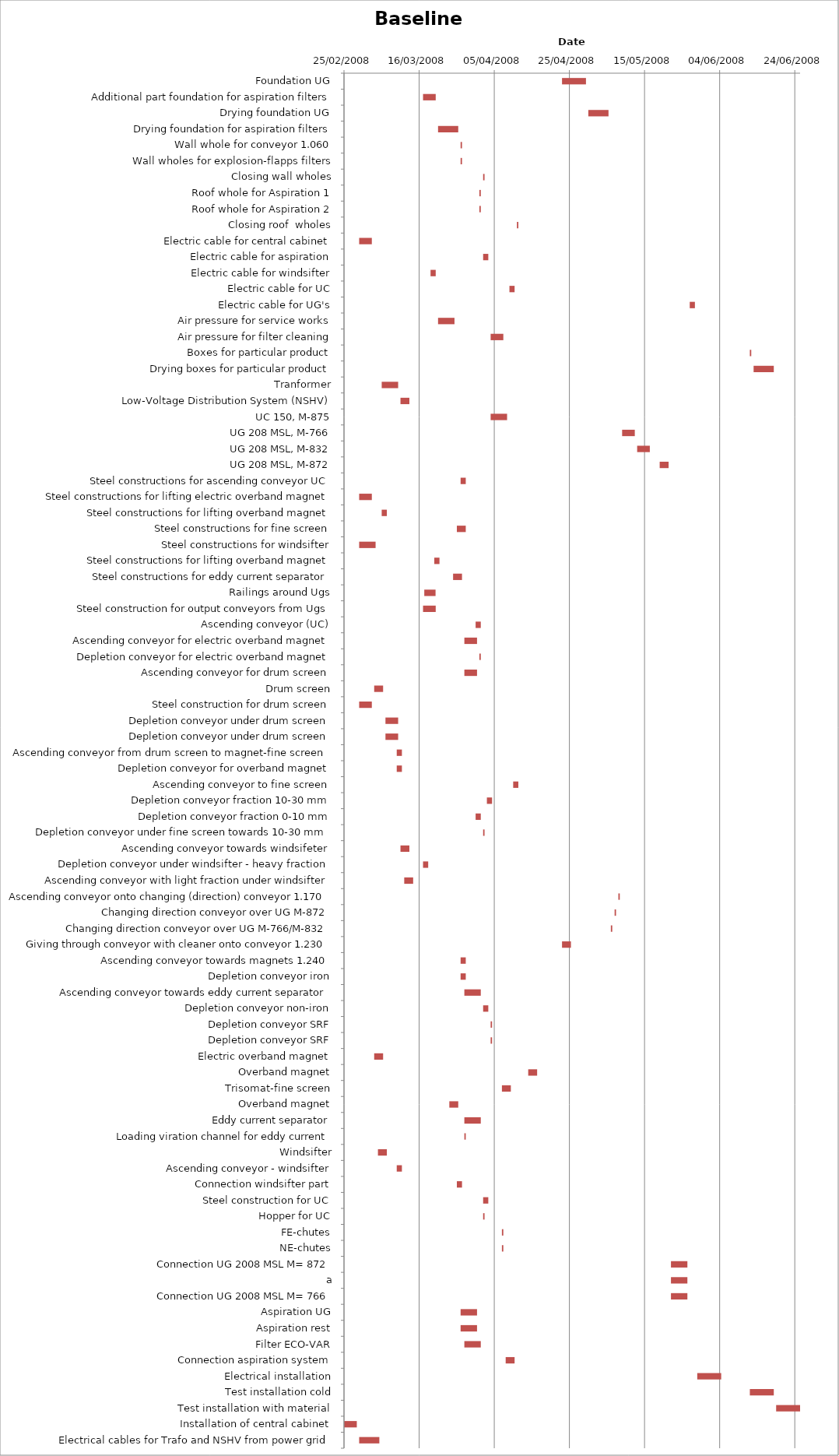
| Category | Baseline start | Actual duration |
|---|---|---|
| Foundation UG | 39561.333 | 6.375 |
| Additional part foundation for aspiration filters | 39524.333 | 3.375 |
| Drying foundation UG | 39568.333 | 5.375 |
| Drying foundation for aspiration filters | 39528.333 | 5.375 |
| Wall whole for conveyor 1.060 | 39534.333 | 0.375 |
| Wall wholes for explosion-flapps filters | 39534.333 | 0.375 |
| Closing wall wholes | 39540.333 | 0.375 |
| Roof whole for Aspiration 1 | 39539.333 | 0.375 |
| Roof whole for Aspiration 2 | 39539.333 | 0.375 |
| Closing roof  wholes | 39549.333 | 0.375 |
| Electric cable for central cabinet | 39507.333 | 3.375 |
| Electric cable for aspiration | 39540.333 | 1.375 |
| Electric cable for windsifter | 39526.333 | 1.375 |
| Electric cable for UC | 39547.333 | 1.375 |
| Electric cable for UG's | 39595.333 | 1.375 |
| Air pressure for service works | 39528.333 | 4.375 |
| Air pressure for filter cleaning | 39542.333 | 3.375 |
| Boxes for particular product | 39611.333 | 0.375 |
| Drying boxes for particular product | 39612.333 | 5.375 |
| Tranformer | 39513.333 | 4.375 |
| Low-Voltage Distribution System (NSHV) | 39518.333 | 2.375 |
| UC 150, M-875 | 39542.333 | 4.375 |
| UG 208 MSL, M-766 | 39577.333 | 3.375 |
| UG 208 MSL, M-832 | 39581.333 | 3.375 |
| UG 208 MSL, M-872 | 39587.333 | 2.375 |
| Steel constructions for ascending conveyor UC | 39534.333 | 1.375 |
| Steel constructions for lifting electric overband magnet | 39507.333 | 3.375 |
| Steel constructions for lifting overband magnet | 39513.333 | 1.375 |
| Steel constructions for fine screen | 39533.333 | 2.375 |
| Steel constructions for windsifter | 39507.333 | 4.375 |
| Steel constructions for lifting overband magnet | 39527.333 | 1.375 |
| Steel constructions for eddy current separator | 39532.333 | 2.375 |
| Railings around Ugs | 39524.667 | 3 |
| Steel construction for output conveyors from Ugs | 39524.333 | 3.375 |
| Ascending conveyor (UC) | 39538.333 | 1.375 |
| Ascending conveyor for electric overband magnet | 39535.333 | 3.375 |
| Depletion conveyor for electric overband magnet | 39539.333 | 0.375 |
| Ascending conveyor for drum screen | 39535.333 | 3.375 |
| Drum screen | 39511.333 | 2.375 |
| Steel construction for drum screen | 39507.333 | 3.375 |
| Depletion conveyor under drum screen | 39514.333 | 3.375 |
| Depletion conveyor under drum screen | 39514.333 | 3.375 |
| Ascending conveyor from drum screen to magnet-fine screen | 39517.333 | 1.375 |
| Depletion conveyor for overband magnet | 39517.333 | 1.375 |
| Ascending conveyor to fine screen | 39548.333 | 1.375 |
| Depletion conveyor fraction 10-30 mm | 39541.333 | 1.375 |
| Depletion conveyor fraction 0-10 mm | 39538.333 | 1.375 |
| Depletion conveyor under fine screen towards 10-30 mm | 39540.333 | 0.375 |
| Ascending conveyor towards windsifeter | 39518.333 | 2.375 |
| Depletion conveyor under windsifter - heavy fraction | 39524.333 | 1.375 |
| Ascending conveyor with light fraction under windsifter | 39519.333 | 2.375 |
| Ascending conveyor onto changing (direction) conveyor 1.170 | 39576.333 | 0.375 |
| Changing direction conveyor over UG M-872 | 39575.333 | 0.375 |
| Changing direction conveyor over UG M-766/M-832 | 39574.333 | 0.375 |
| Giving through conveyor with cleaner onto conveyor 1.230 | 39561.333 | 2.375 |
| Ascending conveyor towards magnets 1.240 | 39534.333 | 1.375 |
| Depletion conveyor iron | 39534.333 | 1.375 |
| Ascending conveyor towards eddy current separator | 39535.333 | 4.375 |
| Depletion conveyor non-iron | 39540.333 | 1.375 |
| Depletion conveyor SRF | 39542.333 | 0.375 |
| Depletion conveyor SRF | 39542.333 | 0.375 |
| Electric overband magnet | 39511.333 | 2.375 |
| Overband magnet | 39552.333 | 2.375 |
| Trisomat-fine screen | 39545.333 | 2.375 |
| Overband magnet | 39531.333 | 2.375 |
| Eddy current separator | 39535.333 | 4.375 |
| Loading viration channel for eddy current | 39535.333 | 0.375 |
| Windsifter | 39512.333 | 2.375 |
| Ascending conveyor - windsifter | 39517.333 | 1.375 |
| Connection windsifter part | 39533.333 | 1.375 |
| Steel construction for UC | 39540.333 | 1.375 |
| Hopper for UC | 39540.333 | 0.375 |
| FE-chutes | 39545.333 | 0.375 |
| NE-chutes | 39545.333 | 0.375 |
| Connection UG 2008 MSL M= 872 | 39590.333 | 4.375 |
| a | 39590.333 | 4.375 |
| Connection UG 2008 MSL M= 766 | 39590.333 | 4.375 |
| Aspiration UG | 39534.333 | 4.375 |
| Aspiration rest | 39534.333 | 4.375 |
| Filter ECO-VAR | 39535.333 | 4.375 |
| Connection aspiration system | 39546.333 | 2.375 |
| Electrical installation | 39597.333 | 6.375 |
| Test installation cold | 39611.333 | 6.375 |
| Test installation with material | 39618.333 | 6.375 |
| Installation of central cabinet | 39503.333 | 3.375 |
| Electrical cables for Trafo and NSHV from power grid | 39507.333 | 5.375 |